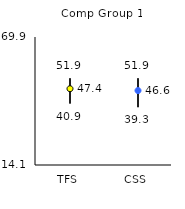
| Category | 25th | 75th | Mean |
|---|---|---|---|
| TFS | 40.9 | 51.9 | 47.35 |
| CSS | 39.3 | 51.9 | 46.55 |